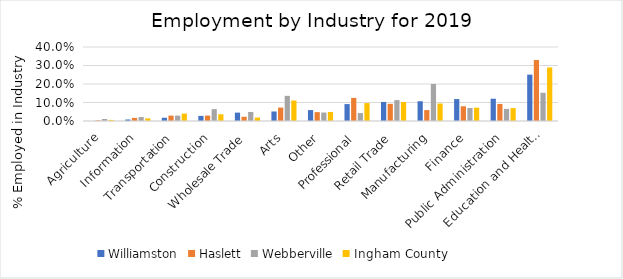
| Category | Williamston | Haslett | Webberville | Ingham County |
|---|---|---|---|---|
|   Agriculture | 0 | 0.003 | 0.011 | 0.006 |
|   Information | 0.008 | 0.017 | 0.021 | 0.014 |
|   Transportation | 0.018 | 0.029 | 0.029 | 0.04 |
|   Construction | 0.028 | 0.029 | 0.064 | 0.036 |
|   Wholesale Trade | 0.045 | 0.023 | 0.049 | 0.019 |
|   Arts | 0.051 | 0.073 | 0.136 | 0.111 |
|   Other | 0.059 | 0.048 | 0.046 | 0.049 |
|   Professional | 0.091 | 0.125 | 0.043 | 0.097 |
|   Retail Trade | 0.103 | 0.093 | 0.113 | 0.103 |
|   Manufacturing | 0.107 | 0.059 | 0.2 | 0.095 |
|   Finance | 0.119 | 0.08 | 0.07 | 0.072 |
|   Public Administration | 0.121 | 0.092 | 0.066 | 0.07 |
|   Education and Health care | 0.251 | 0.33 | 0.153 | 0.289 |